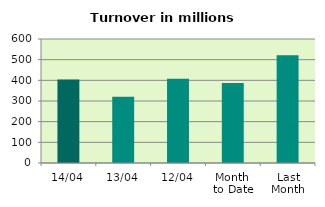
| Category | Series 0 |
|---|---|
| 14/04 | 403.481 |
| 13/04 | 320.772 |
| 12/04 | 407.873 |
| Month 
to Date | 387.646 |
| Last
Month | 521.26 |